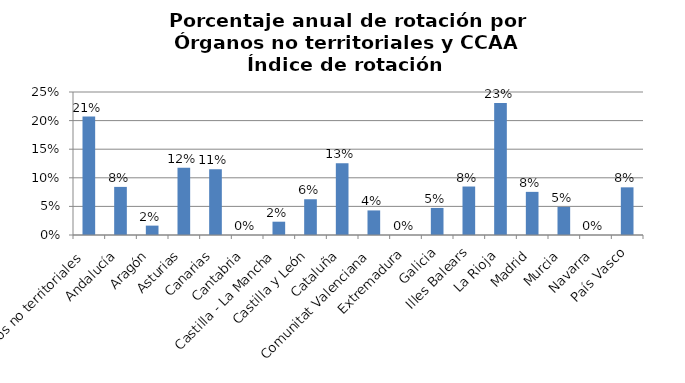
| Category | Porcentaje |
|---|---|
| Órganos no territoriales | 0.207 |
| Andalucía | 0.084 |
| Aragón | 0.016 |
| Asturias | 0.118 |
| Canarias | 0.115 |
| Cantabria | 0 |
| Castilla - La Mancha | 0.023 |
| Castilla y León | 0.062 |
| Cataluña | 0.126 |
| Comunitat Valenciana | 0.043 |
| Extremadura | 0 |
| Galicia | 0.047 |
| Illes Balears | 0.085 |
| La Rioja | 0.231 |
| Madrid | 0.075 |
| Murcia | 0.049 |
| Navarra | 0 |
| País Vasco | 0.083 |